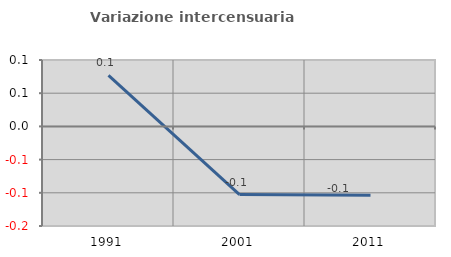
| Category | Variazione intercensuaria annua |
|---|---|
| 1991.0 | 0.077 |
| 2001.0 | -0.103 |
| 2011.0 | -0.104 |